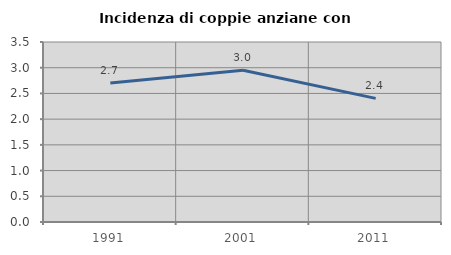
| Category | Incidenza di coppie anziane con figli |
|---|---|
| 1991.0 | 2.703 |
| 2001.0 | 2.951 |
| 2011.0 | 2.404 |